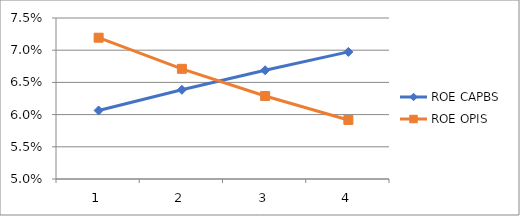
| Category | ROE CAPBS | ROE OPIS |
|---|---|---|
| 0 | 0.061 | 0.072 |
| 1 | 0.064 | 0.067 |
| 2 | 0.067 | 0.063 |
| 3 | 0.07 | 0.059 |